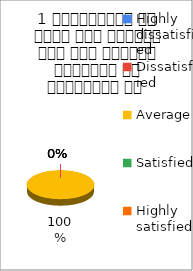
| Category | 1 व्याख्यान से रूचि में वृद्धि हुई एवं शिक्षण जानकारी से परिपूर्ण था  |
|---|---|
| Highly dissatisfied | 0 |
| Dissatisfied | 0 |
| Average | 1 |
| Satisfied | 0 |
| Highly satisfied | 0 |